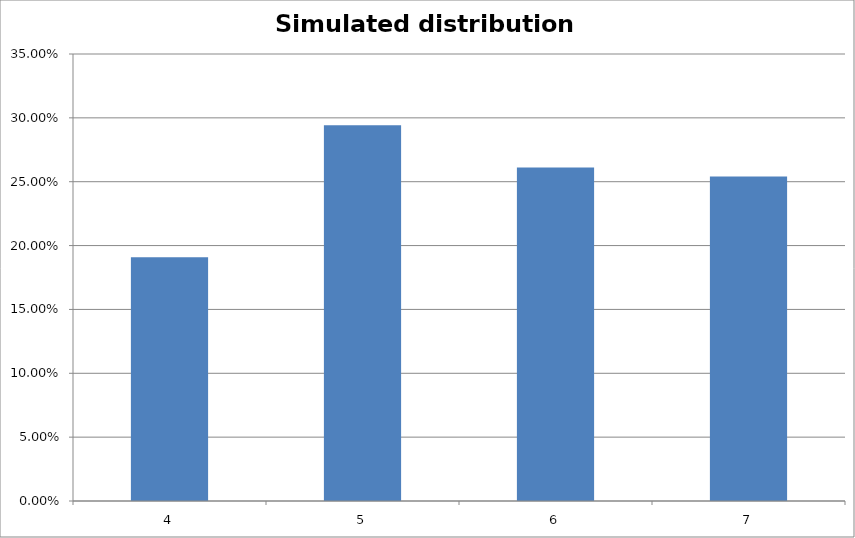
| Category | Simulated distribution function |
|---|---|
| 4.0 | 0.191 |
| 5.0 | 0.294 |
| 6.0 | 0.261 |
| 7.0 | 0.254 |